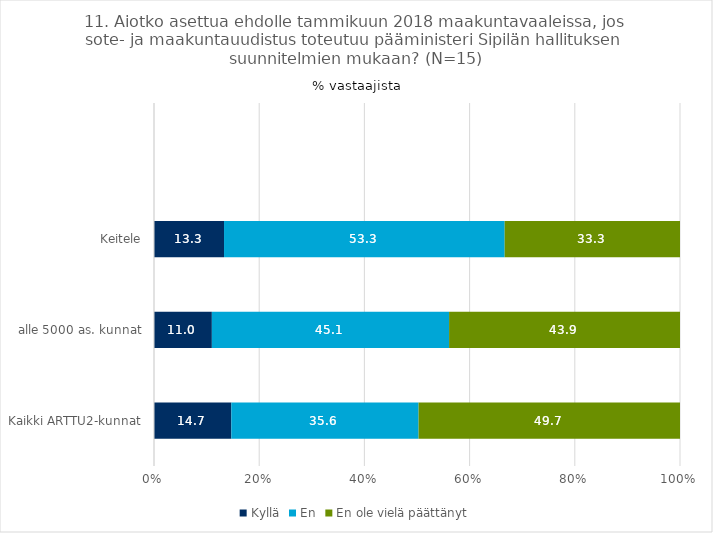
| Category | Kyllä | En | En ole vielä päättänyt |
|---|---|---|---|
| Kaikki ARTTU2-kunnat | 14.7 | 35.6 | 49.7 |
| alle 5000 as. kunnat | 11 | 45.1 | 43.9 |
| Keitele | 13.3 | 53.3 | 33.3 |